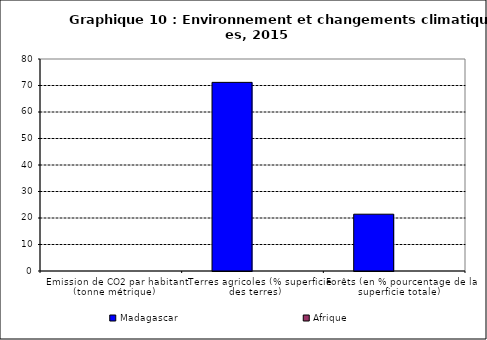
| Category | Madagascar | Afrique |
|---|---|---|
| Emission de CO2 par habitant (tonne métrique) | 0 | 0 |
| Terres agricoles (% superficie des terres) | 71.184 | 0 |
| Forêts (en % pourcentage de la superficie totale) | 21.439 | 0 |